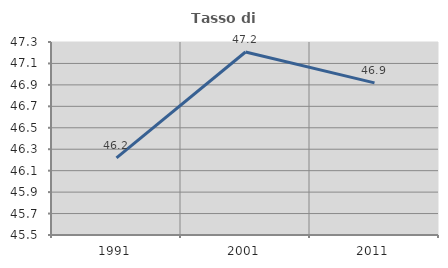
| Category | Tasso di occupazione   |
|---|---|
| 1991.0 | 46.218 |
| 2001.0 | 47.207 |
| 2011.0 | 46.919 |